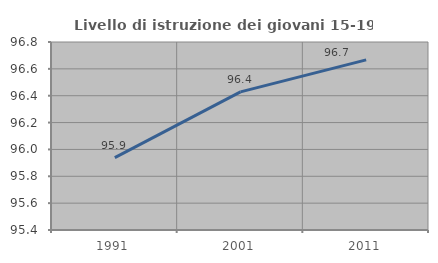
| Category | Livello di istruzione dei giovani 15-19 anni |
|---|---|
| 1991.0 | 95.939 |
| 2001.0 | 96.429 |
| 2011.0 | 96.667 |